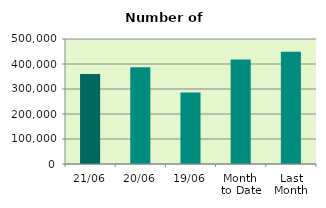
| Category | Series 0 |
|---|---|
| 21/06 | 359612 |
| 20/06 | 386962 |
| 19/06 | 286048 |
| Month 
to Date | 418099.067 |
| Last
Month | 449234.545 |